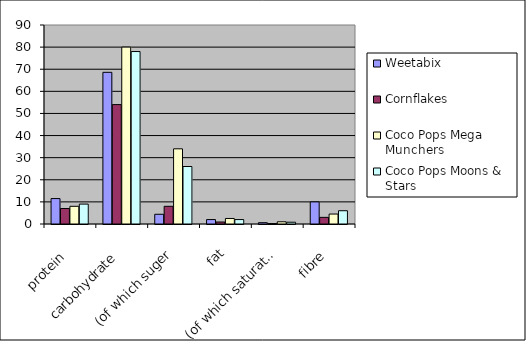
| Category | Weetabix | Cornflakes | Coco Pops Mega Munchers | Coco Pops Moons & Stars |
|---|---|---|---|---|
| protein | 11.5 | 7 | 8 | 9 |
| carbohydrate | 68.6 | 54 | 80 | 78 |
| (of which suger | 4.4 | 8 | 34 | 26 |
| fat | 2 | 0.9 | 2.5 | 2 |
| (of which saturates) | 0.6 | 0.2 | 1 | 0.8 |
| fibre | 10 | 3 | 4.5 | 6 |